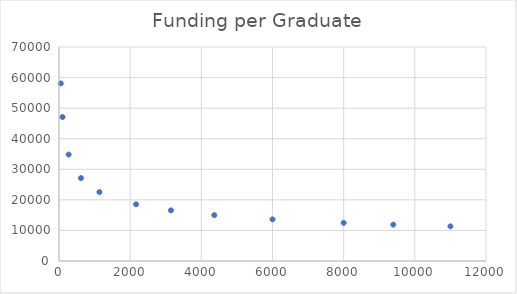
| Category | Funding per Graduate |
|---|---|
| 50.0 | 58098.83 |
| 100.0 | 47092.457 |
| 271.0 | 34814.167 |
| 618.0 | 27118.867 |
| 1136.0 | 22550.593 |
| 2167.0 | 18542.517 |
| 3145.0 | 16563.526 |
| 4365.0 | 14997.358 |
| 6000.0 | 13619.098 |
| 8000.0 | 12482.176 |
| 9394.0 | 11889.181 |
| 11000.0 | 11333.989 |